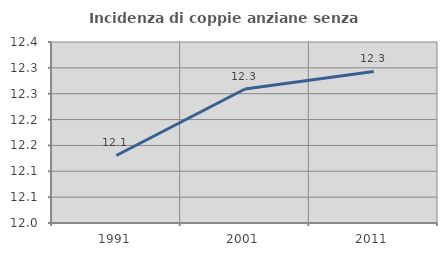
| Category | Incidenza di coppie anziane senza figli  |
|---|---|
| 1991.0 | 12.131 |
| 2001.0 | 12.259 |
| 2011.0 | 12.293 |